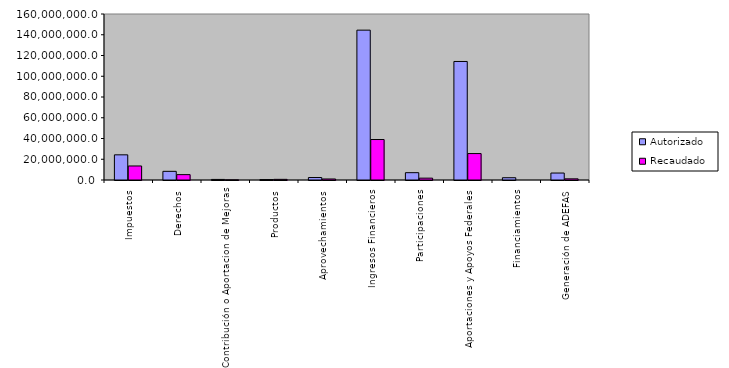
| Category | Autorizado | Recaudado |
|---|---|---|
| 0 | 24258736.4 | 13515963.4 |
| 1 | 8345615.3 | 5167189.5 |
| 2 | 549841.9 | 155052.2 |
| 3 | 412076.9 | 626111 |
| 4 | 2392843.2 | 990480.2 |
| 5 | 144435639 | 39012351 |
| 6 | 7052274.2 | 1785098.1 |
| 7 | 114241050.7 | 25468862 |
| 8 | 2195832.7 | 0 |
| 9 | 6709482.3 | 1123832.3 |